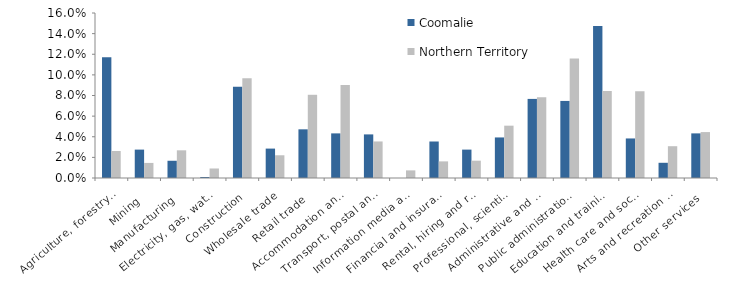
| Category | Coomalie | Northern Territory |
|---|---|---|
| Agriculture, forestry and fishing | 0.117 | 0.026 |
| Mining | 0.028 | 0.015 |
| Manufacturing | 0.017 | 0.027 |
| Electricity, gas, water and waste services | 0.001 | 0.009 |
| Construction | 0.088 | 0.097 |
| Wholesale trade | 0.029 | 0.022 |
| Retail trade | 0.047 | 0.081 |
| Accommodation and food services | 0.043 | 0.09 |
| Transport, postal and warehousing | 0.042 | 0.035 |
| Information media and telecommunications | 0 | 0.007 |
| Financial and insurance services | 0.035 | 0.016 |
| Rental, hiring and real estate services | 0.028 | 0.017 |
| Professional, scientific and technical services | 0.039 | 0.051 |
| Administrative and support services | 0.077 | 0.078 |
| Public administration and safety | 0.075 | 0.116 |
| Education and training | 0.147 | 0.084 |
| Health care and social assistance | 0.038 | 0.084 |
| Arts and recreation services | 0.015 | 0.031 |
| Other services | 0.043 | 0.045 |